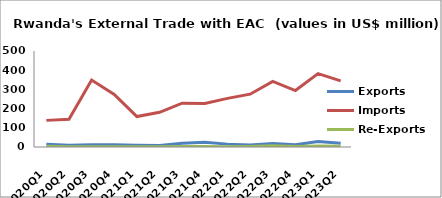
| Category | Exports | Imports | Re-Exports |
|---|---|---|---|
| 2020Q1 | 14.209 | 138.663 | 3.748 |
| 2020Q2 | 8.786 | 144.885 | 1.712 |
| 2020Q3 | 11.767 | 348.723 | 1.141 |
| 2020Q4 | 12.136 | 273.335 | 0.92 |
| 2021Q1 | 9.302 | 158.626 | 0.693 |
| 2021Q2 | 7.396 | 180.858 | 1.076 |
| 2021Q3 | 19.208 | 228.408 | 2.214 |
| 2021Q4 | 24.275 | 227.083 | 3.044 |
| 2022Q1 | 14.976 | 253.288 | 1.717 |
| 2022Q2 | 10.835 | 275.058 | 3.227 |
| 2022Q3 | 18.34 | 341.329 | 6.748 |
| 2022Q4 | 11.691 | 294.155 | 2.456 |
| 2023Q1 | 28.708 | 382.295 | 4.582 |
| 2023Q2 | 19.479 | 344.376 | 3.772 |